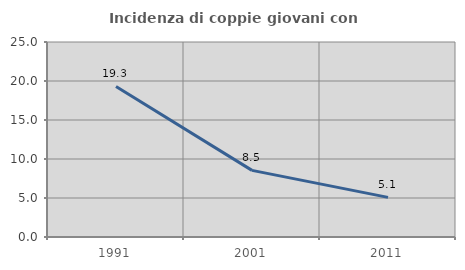
| Category | Incidenza di coppie giovani con figli |
|---|---|
| 1991.0 | 19.298 |
| 2001.0 | 8.543 |
| 2011.0 | 5.079 |